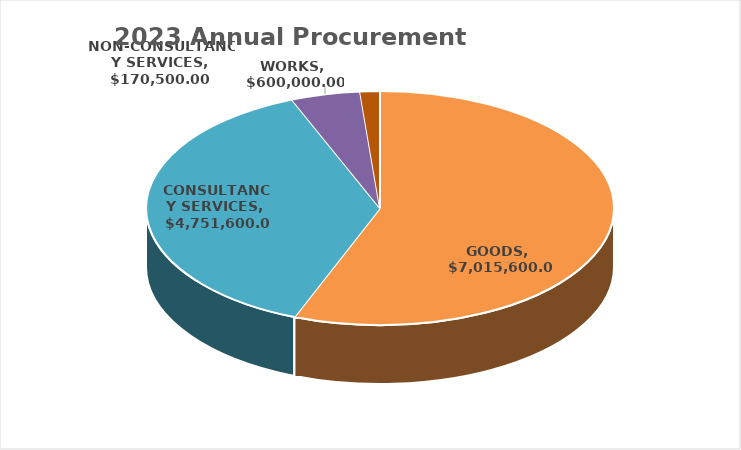
| Category | Series 0 |
|---|---|
| GOODS | 7015600 |
| CONSULTANCY SERVICES | 4751600 |
| WORKS | 600000 |
| NON-CONSULTANCY SERVICES | 170500 |